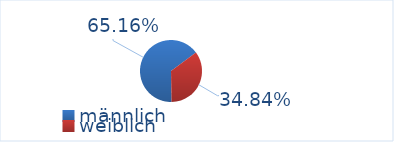
| Category | Series 0 |
|---|---|
| männlich | 65.163 |
| weiblich | 34.837 |